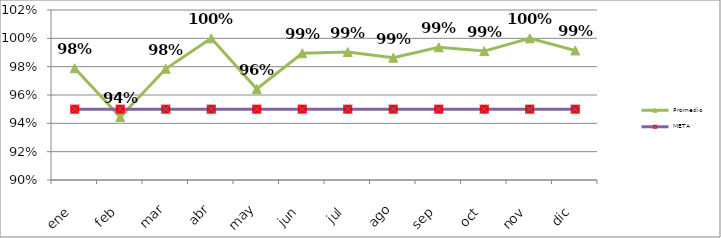
| Category | Promedio | META  |
|---|---|---|
| ene | 0.979 | 0.95 |
| feb | 0.944 | 0.95 |
| mar | 0.978 | 0.95 |
| abr | 1 | 0.95 |
| may | 0.964 | 0.95 |
| jun | 0.989 | 0.95 |
| jul | 0.99 | 0.95 |
| ago | 0.986 | 0.95 |
| sep | 0.994 | 0.95 |
| oct | 0.991 | 0.95 |
| nov | 1 | 0.95 |
| dic | 0.991 | 0.95 |